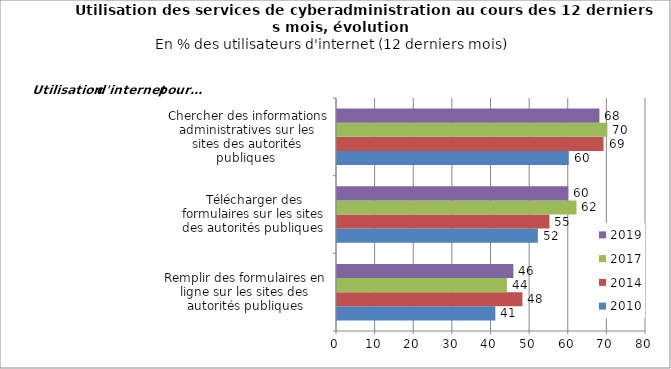
| Category | 2010 | 2014 | 2017 | 2019 |
|---|---|---|---|---|
| Remplir des formulaires en ligne sur les sites des autorités publiques | 41 | 48 | 44 | 45.664 |
| Télécharger des formulaires sur les sites des autorités publiques  | 52 | 55 | 62 | 59.885 |
| Chercher des informations administratives sur les sites des autorités publiques  | 60 | 69 | 70 | 67.94 |